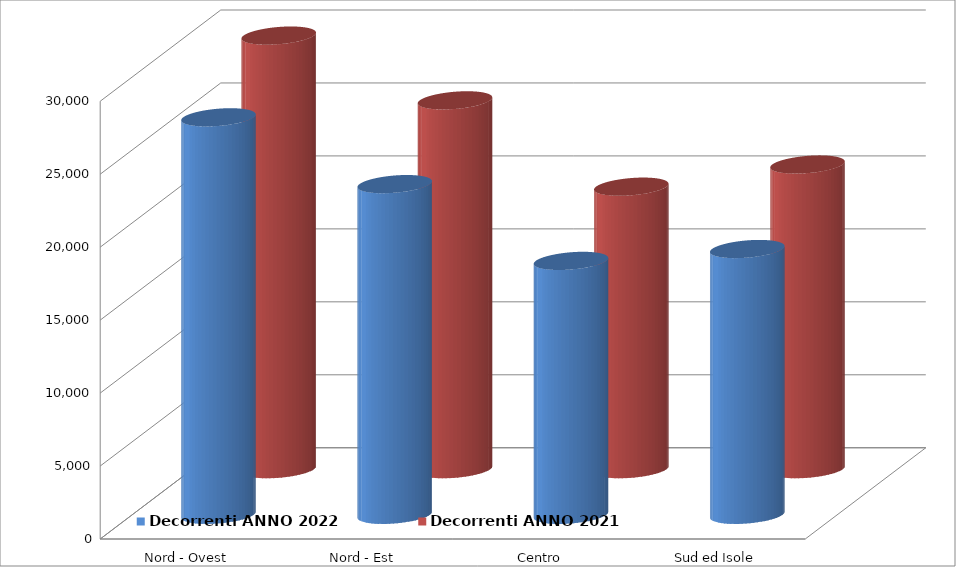
| Category | Decorrenti ANNO 2022 | Decorrenti ANNO 2021 |
|---|---|---|
| Nord - Ovest | 27240 | 29715 |
| Nord - Est | 22663 | 25277 |
| Centro | 17401 | 19361 |
| Sud ed Isole | 18215 | 20881 |